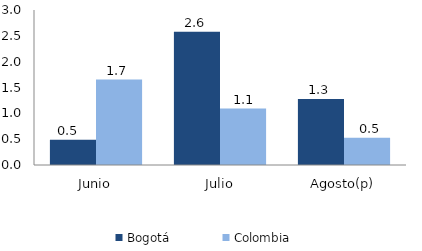
| Category | Bogotá | Colombia |
|---|---|---|
| Junio | 0.487 | 1.652 |
| Julio | 2.578 | 1.091 |
| Agosto(p) | 1.278 | 0.527 |